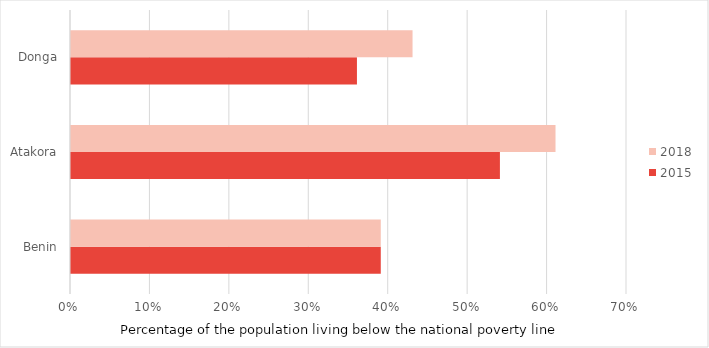
| Category | 2015 | 2018 |
|---|---|---|
| Benin | 0.39 | 0.39 |
| Atakora | 0.54 | 0.61 |
| Donga | 0.36 | 0.43 |